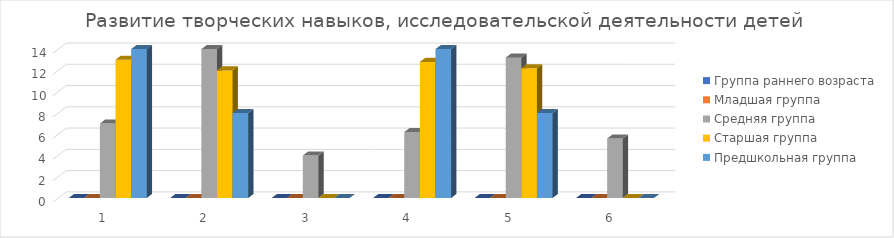
| Category | Группа раннего возраста | Младшая группа | Средняя группа | Старшая группа | Предшкольная группа |
|---|---|---|---|---|---|
| 0 | 0 | 0 | 7 | 13 | 14 |
| 1 | 0 | 0 | 14 | 12 | 8 |
| 2 | 0 | 0 | 4 | 0 | 0 |
| 3 | 0 | 0 | 6.2 | 12.8 | 14 |
| 4 | 0 | 0 | 13.2 | 12.2 | 8 |
| 5 | 0 | 0 | 5.6 | 0 | 0 |